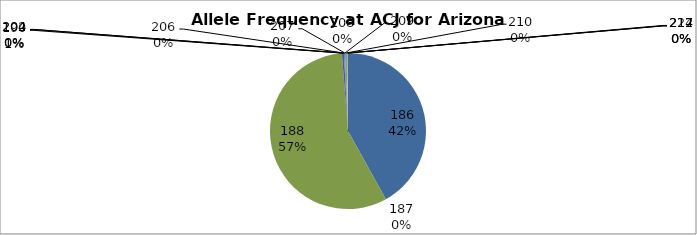
| Category | Series 0 |
|---|---|
| 186.0 | 0.419 |
| 187.0 | 0 |
| 188.0 | 0.568 |
| 190.0 | 0.004 |
| 202.0 | 0 |
| 204.0 | 0 |
| 206.0 | 0.002 |
| 207.0 | 0 |
| 208.0 | 0 |
| 209.0 | 0 |
| 210.0 | 0.004 |
| 212.0 | 0.002 |
| 214.0 | 0 |
| 227.0 | 0 |